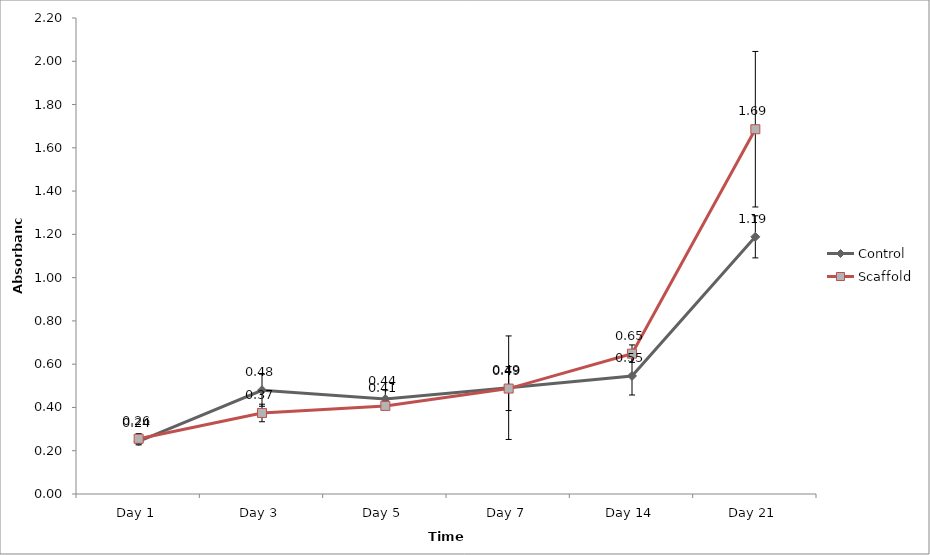
| Category | Control | Scaffold |
|---|---|---|
| Day 1 | 0.243 | 0.255 |
| Day 3 | 0.48 | 0.375 |
| Day 5 | 0.439 | 0.407 |
| Day 7 | 0.491 | 0.487 |
| Day 14 | 0.546 | 0.649 |
| Day 21 | 1.189 | 1.686 |